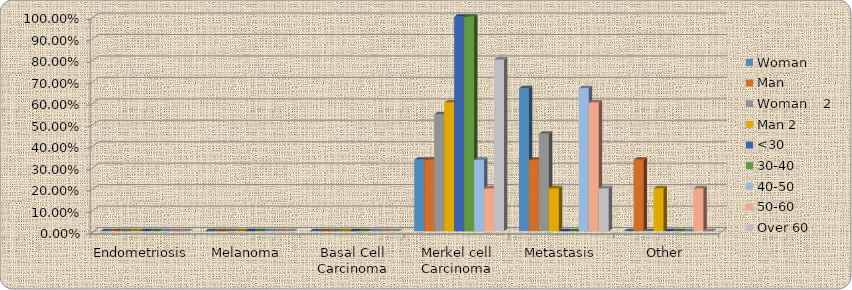
| Category | Woman     | Man  | Woman    2 | Man 2 | <30 | 30-40 | 40-50 | 50-60 | Over 60 |
|---|---|---|---|---|---|---|---|---|---|
| Endometriosis | 0 | 0 | 0 | 0 | 0 | 0 | 0 | 0 | 0 |
| Melanoma | 0 | 0 | 0 | 0 | 0 | 0 | 0 | 0 | 0 |
| Basal Cell Carcinoma | 0 | 0 | 0 | 0 | 0 | 0 | 0 | 0 | 0 |
| Merkel cell Carcinoma | 0.333 | 0.333 | 0.546 | 0.6 | 1 | 1 | 0.333 | 0.2 | 0.8 |
| Metastasis | 0.667 | 0.333 | 0.454 | 0.2 | 0 | 0 | 0.667 | 0.6 | 0.2 |
| Other | 0 | 0.333 | 0 | 0.2 | 0 | 0 | 0 | 0.2 | 0 |